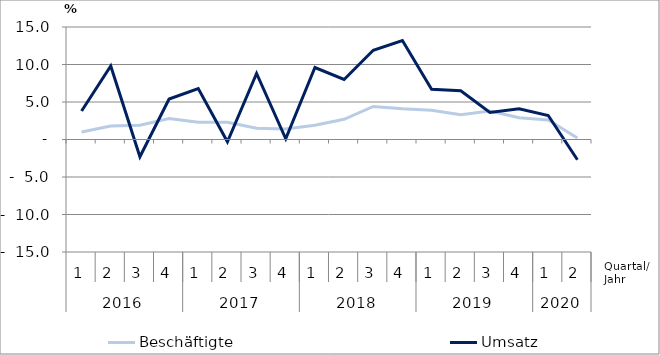
| Category | Beschäftigte | Umsatz |
|---|---|---|
| 0 | 1 | 3.8 |
| 1 | 1.8 | 9.8 |
| 2 | 1.9 | -2.3 |
| 3 | 2.8 | 5.4 |
| 4 | 2.3 | 6.8 |
| 5 | 2.3 | -0.3 |
| 6 | 1.5 | 8.8 |
| 7 | 1.4 | 0.1 |
| 8 | 1.9 | 9.6 |
| 9 | 2.7 | 8 |
| 10 | 4.4 | 11.9 |
| 11 | 4.1 | 13.2 |
| 12 | 3.9 | 6.7 |
| 13 | 3.3 | 6.5 |
| 14 | 3.8 | 3.6 |
| 15 | 2.9 | 4.1 |
| 16 | 2.6 | 3.2 |
| 17 | 0.2 | -2.7 |